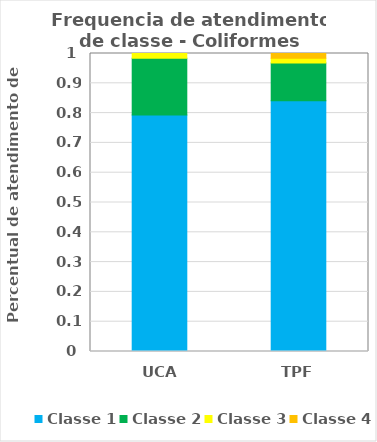
| Category | Classe 1 | Classe 2 | Classe 3 | Classe 4 |
|---|---|---|---|---|
| UCA | 0.794 | 0.19 | 0.016 | 0 |
| TPF | 0.841 | 0.127 | 0.016 | 0.016 |